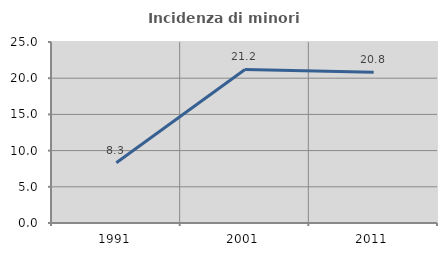
| Category | Incidenza di minori stranieri |
|---|---|
| 1991.0 | 8.333 |
| 2001.0 | 21.212 |
| 2011.0 | 20.809 |